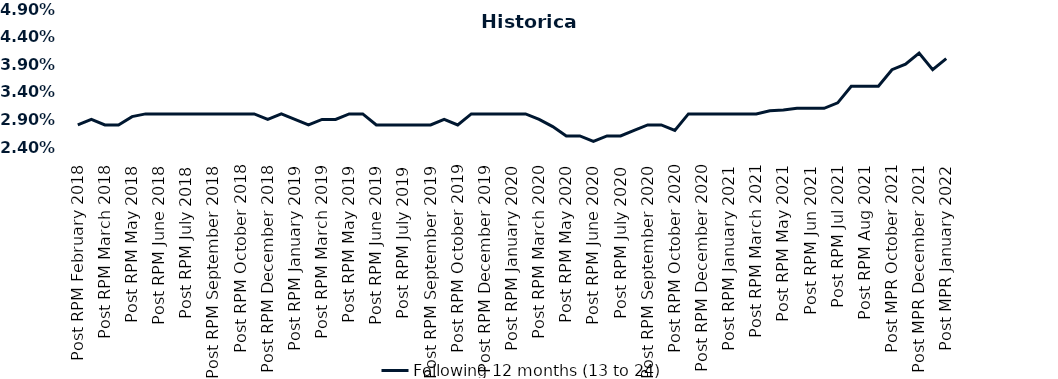
| Category | Following 12 months (13 to 24)  |
|---|---|
| Post RPM February 2018 | 0.028 |
| Pre RPM March 2018 | 0.029 |
| Post RPM March 2018 | 0.028 |
| Pre RPM May 2018 | 0.028 |
| Post RPM May 2018 | 0.03 |
| Pre RPM June 2018 | 0.03 |
| Post RPM June 2018 | 0.03 |
| Pre RPM July 2018 | 0.03 |
| Post RPM July 2018 | 0.03 |
| Pre RPM September 2018 | 0.03 |
| Post RPM September 2018 | 0.03 |
| Pre RPM October 2018 | 0.03 |
| Post RPM October 2018 | 0.03 |
| Pre RPM December 2018 | 0.03 |
| Post RPM December 2018 | 0.029 |
| Pre RPM January 2019 | 0.03 |
| Post RPM January 2019 | 0.029 |
| Pre RPM March 2019 | 0.028 |
| Post RPM March 2019 | 0.029 |
| Pre RPM May 2019 | 0.029 |
| Post RPM May 2019 | 0.03 |
| Pre RPM June 2019 | 0.03 |
| Post RPM June 2019 | 0.028 |
| Pre RPM July 2019 | 0.028 |
| Post RPM July 2019 | 0.028 |
| Pre RPM September 2019 | 0.028 |
| Post RPM September 2019 | 0.028 |
| Pre RPM October 2019 | 0.029 |
| Post RPM October 2019 | 0.028 |
| Pre RPM December 2019 | 0.03 |
| Post RPM December 2019 | 0.03 |
| Pre RPM January 2020 | 0.03 |
| Post RPM January 2020 | 0.03 |
| Pre RPM March 2020 | 0.03 |
| Post RPM March 2020 | 0.029 |
| Pre RPM May 2020 | 0.028 |
| Post RPM May 2020 | 0.026 |
| Pre RPM June 2020 | 0.026 |
| Post RPM June 2020 | 0.025 |
| Pre RPM July 2020 | 0.026 |
| Post RPM July 2020 | 0.026 |
| Pre RPM September 2020 | 0.027 |
| Post RPM September 2020 | 0.028 |
| Pre RPM October 2020 | 0.028 |
| Post RPM October 2020 | 0.027 |
| Pre RPM December 2020 | 0.03 |
|  Post RPM December 2020 | 0.03 |
| Pre RPM January 2021 | 0.03 |
| Post RPM January 2021 | 0.03 |
|  Pre RPM March 2021 | 0.03 |
|  Post RPM March 2021 | 0.03 |
|  Pre RPM May 2021 | 0.031 |
|  Post RPM May 2021 | 0.031 |
|  Pre RPM Jun 2021 | 0.031 |
|   Post RPM Jun 2021 | 0.031 |
| Pre RPM Jul 2021 | 0.031 |
|  Post RPM Jul 2021 | 0.032 |
| Pre RPM Aug 2021 | 0.035 |
|  Post RPM Aug 2021 | 0.035 |
| Pre MPR October 2021 | 0.035 |
| Post MPR October 2021 | 0.038 |
| Pre MPR December 2021 | 0.039 |
| Post MPR December 2021 | 0.041 |
| Pre MPR January 2022 | 0.038 |
| Post MPR January 2022 | 0.04 |